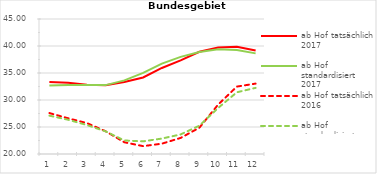
| Category | ab Hof tatsächlich 2017 | ab Hof standardisiert 2017 | ab Hof tatsächlich 2016 | ab Hof standardisiert 2016 |
|---|---|---|---|---|
| 0 | 33.328 | 32.697 | 27.581 | 27.101 |
| 1 | 33.176 | 32.78 | 26.617 | 26.346 |
| 2 | 32.808 | 32.756 | 25.728 | 25.367 |
| 3 | 32.717 | 32.755 | 24.214 | 24.187 |
| 4 | 33.349 | 33.63 | 22.171 | 22.506 |
| 5 | 34.173 | 35.011 | 21.456 | 22.344 |
| 6 | 35.929 | 36.745 | 21.913 | 22.86 |
| 7 | 37.343 | 37.98 | 22.976 | 23.625 |
| 8 | 38.941 | 38.902 | 24.871 | 25.241 |
| 9 | 39.716 | 39.381 | 29.146 | 28.521 |
| 10 | 39.873 | 39.279 | 32.482 | 31.431 |
| 11 | 39.151 | 38.631 | 33.038 | 32.248 |